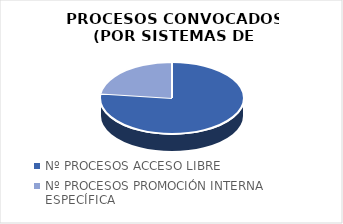
| Category | Series 0 |
|---|---|
| Nº PROCESOS ACCESO LIBRE | 30 |
| Nº PROCESOS PROMOCIÓN INTERNA ESPECÍFICA | 9 |